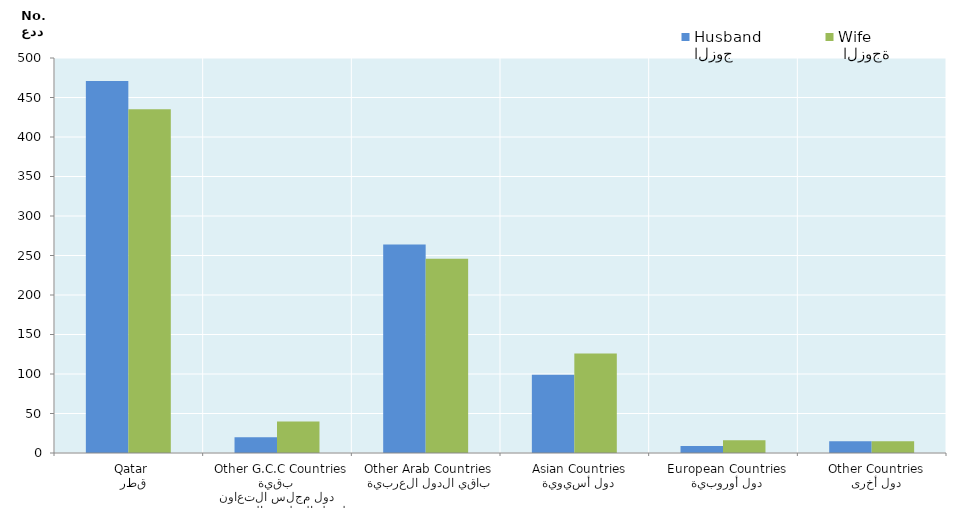
| Category | الزوج
Husband |  الزوجة
Wife |
|---|---|---|
|   قطر
 Qatar | 471 | 435 |
|  بقية دول مجلس التعاون لدول الخليج العربية
  Other G.C.C Countries | 20 | 40 |
|   باقي الدول العربية
 Other Arab Countries | 264 | 246 |
|   دول أسيوية
  Asian Countries | 99 | 126 |
|   دول أوروبية
  European Countries | 9 | 16 |
|   دول أخرى
  Other Countries | 15 | 15 |